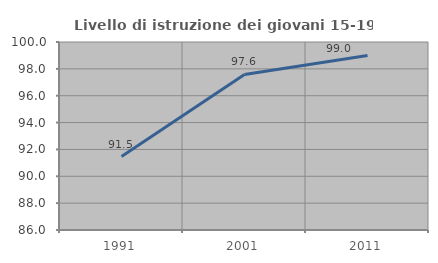
| Category | Livello di istruzione dei giovani 15-19 anni |
|---|---|
| 1991.0 | 91.468 |
| 2001.0 | 97.586 |
| 2011.0 | 98.987 |